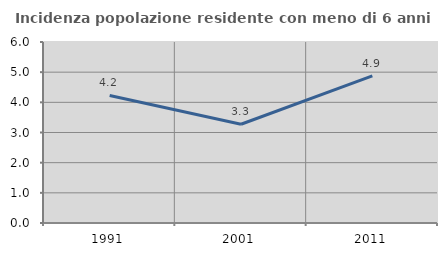
| Category | Incidenza popolazione residente con meno di 6 anni |
|---|---|
| 1991.0 | 4.227 |
| 2001.0 | 3.274 |
| 2011.0 | 4.874 |